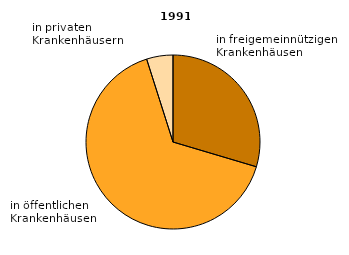
| Category | Series 0 |
|---|---|
| 0 | 29.6 |
| 1 | 65.5 |
| 2 | 4.9 |